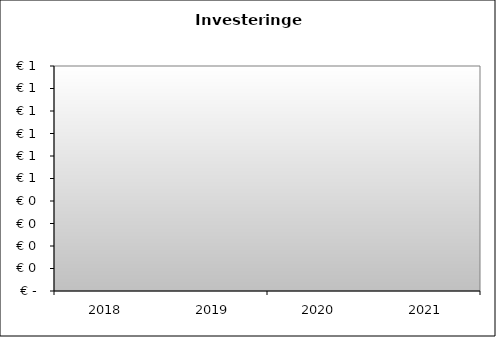
| Category | Series 0 |
|---|---|
| 2018.0 | 0 |
| 2019.0 | 0 |
| 2020.0 | 0 |
| 2021.0 | 0 |